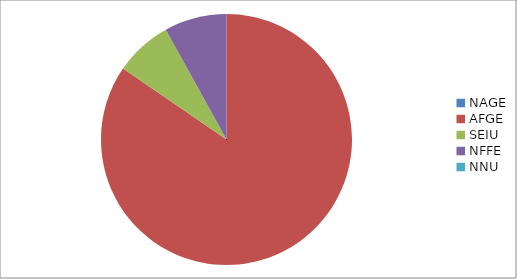
| Category | Series 0 |
|---|---|
| NAGE | 0 |
| AFGE | 9673 |
| SEIU | 847 |
| NFFE | 919 |
| NNU | 0 |